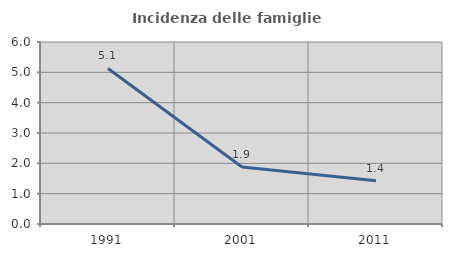
| Category | Incidenza delle famiglie numerose |
|---|---|
| 1991.0 | 5.128 |
| 2001.0 | 1.88 |
| 2011.0 | 1.429 |